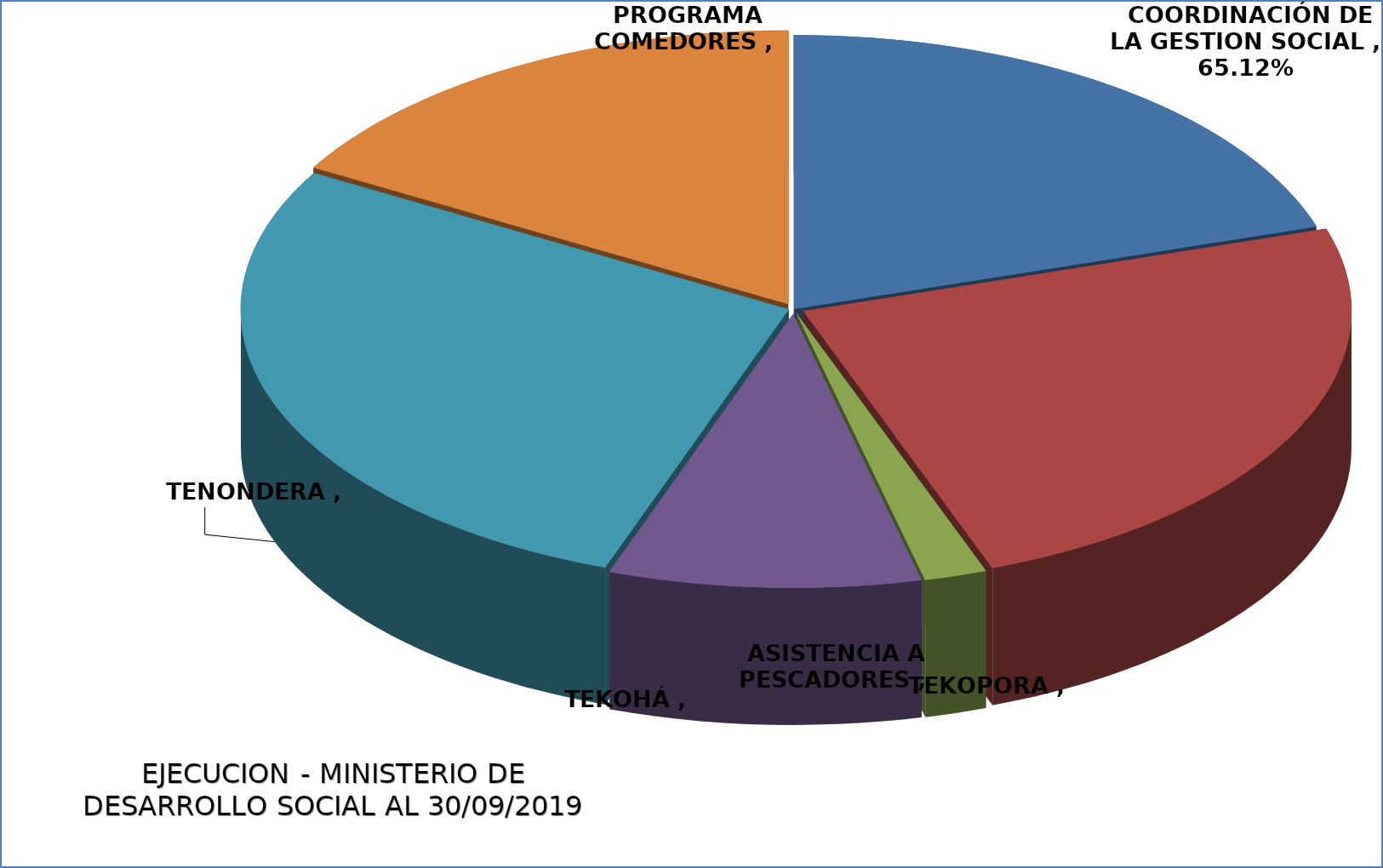
| Category | EJECUCIÓN - MINISTERIO DE DESARROLLO SOCIAL |
|---|---|
| COORDINACIÓN DE LA GESTION SOCIAL | 0.651 |
| TEKOPORA | 0.785 |
| ASISTENCIA A PESCADORES | 0.06 |
| TEKOHÁ | 0.298 |
| TENONDERA | 0.902 |
| PROGRAMA COMEDORES | 0.54 |